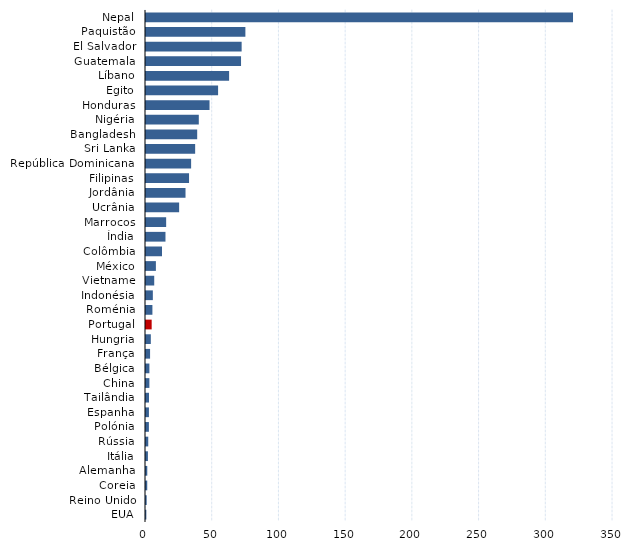
| Category | Series 2 |
|---|---|
| Nepal | 320.033 |
| Paquistão | 74.486 |
| El Salvador | 71.678 |
| Guatemala | 71.234 |
| Líbano | 62.283 |
| Egito | 54.029 |
| Honduras | 47.611 |
| Nigéria | 39.57 |
| Bangladesh | 38.368 |
| Sri Lanka | 36.839 |
| República Dominicana  | 33.818 |
| Filipinas | 32.262 |
| Jordânia | 29.618 |
| Ucrânia | 24.835 |
| Marrocos | 15.107 |
| Índia | 14.594 |
| Colômbia | 12.01 |
| México | 7.41 |
| Vietname | 6.165 |
| Indonésia | 5.129 |
| Roménia | 4.805 |
| Portugal | 4.246 |
| Hungria | 3.611 |
| França | 3.055 |
| Bélgica | 2.55 |
| China | 2.539 |
| Tailândia | 2.271 |
| Espanha | 2.198 |
| Polónia | 2.17 |
| Rússia | 1.69 |
| Itália | 1.439 |
| Alemanha | 0.96 |
| Coreia | 0.934 |
| Reino Unido | 0.514 |
| EUA | 0.264 |